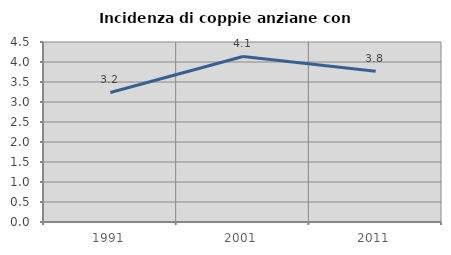
| Category | Incidenza di coppie anziane con figli |
|---|---|
| 1991.0 | 3.238 |
| 2001.0 | 4.138 |
| 2011.0 | 3.768 |